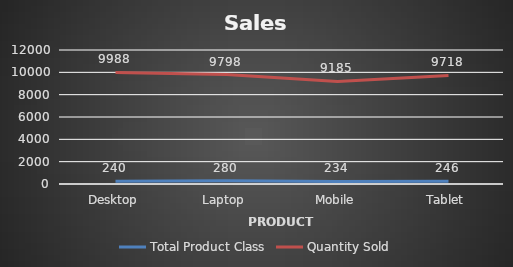
| Category | Total Product Class | Quantity Sold |
|---|---|---|
| Desktop | 240 | 9988 |
| Laptop | 280 | 9798 |
| Mobile | 234 | 9185 |
| Tablet | 246 | 9718 |